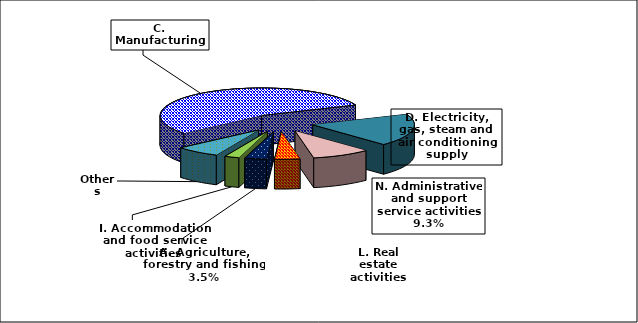
| Category | Series 0 |
|---|---|
| C. Manufacturing | 0.549 |
| D. Electricity, gas, steam and air conditioning supply | 0.19 |
| N. Administrative and support service activities | 0.093 |
| L. Real estate activities | 0.04 |
| A. Agriculture, forestry and fishing | 0.035 |
| I. Accommodation and food service activities | 0.023 |
| Others | 0.07 |